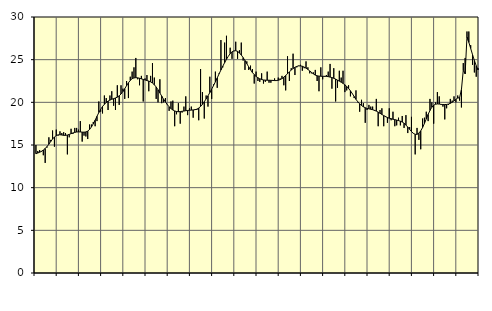
| Category | Piggar | Series 1 |
|---|---|---|
| nan | 15 | 13.97 |
| 1.0 | 14.3 | 14.06 |
| 1.0 | 14.4 | 14.15 |
| 1.0 | 14.2 | 14.26 |
| 1.0 | 13.8 | 14.41 |
| 1.0 | 12.9 | 14.59 |
| 1.0 | 14.7 | 14.82 |
| 1.0 | 15.9 | 15.1 |
| 1.0 | 15.6 | 15.41 |
| 1.0 | 16.7 | 15.7 |
| 1.0 | 14.8 | 15.94 |
| 1.0 | 16.8 | 16.11 |
| nan | 16.1 | 16.19 |
| 2.0 | 16.6 | 16.2 |
| 2.0 | 16.4 | 16.17 |
| 2.0 | 16.5 | 16.13 |
| 2.0 | 16.4 | 16.13 |
| 2.0 | 13.9 | 16.17 |
| 2.0 | 15.9 | 16.24 |
| 2.0 | 16.9 | 16.33 |
| 2.0 | 16.3 | 16.41 |
| 2.0 | 17 | 16.48 |
| 2.0 | 17 | 16.52 |
| 2.0 | 16.8 | 16.54 |
| nan | 17.8 | 16.53 |
| 3.0 | 15.4 | 16.51 |
| 3.0 | 16.1 | 16.5 |
| 3.0 | 16 | 16.53 |
| 3.0 | 15.7 | 16.63 |
| 3.0 | 17.4 | 16.82 |
| 3.0 | 17.4 | 17.11 |
| 3.0 | 17.7 | 17.48 |
| 3.0 | 17.2 | 17.91 |
| 3.0 | 17.8 | 18.36 |
| 3.0 | 20.1 | 18.8 |
| 3.0 | 18.9 | 19.19 |
| nan | 18.7 | 19.51 |
| 4.0 | 20.8 | 19.77 |
| 4.0 | 20.5 | 19.98 |
| 4.0 | 19.1 | 20.14 |
| 4.0 | 20.8 | 20.26 |
| 4.0 | 21.3 | 20.36 |
| 4.0 | 19.6 | 20.43 |
| 4.0 | 19.1 | 20.51 |
| 4.0 | 22 | 20.61 |
| 4.0 | 19.7 | 20.76 |
| 4.0 | 22 | 20.98 |
| 4.0 | 21.6 | 21.26 |
| nan | 20.4 | 21.6 |
| 5.0 | 22.5 | 21.95 |
| 5.0 | 20.5 | 22.29 |
| 5.0 | 23 | 22.57 |
| 5.0 | 23.6 | 22.77 |
| 5.0 | 24.1 | 22.86 |
| 5.0 | 25.2 | 22.89 |
| 5.0 | 22.7 | 22.87 |
| 5.0 | 22 | 22.82 |
| 5.0 | 23.1 | 22.75 |
| 5.0 | 20.1 | 22.69 |
| 5.0 | 22.8 | 22.62 |
| nan | 23.2 | 22.55 |
| 6.0 | 21.3 | 22.49 |
| 6.0 | 23.1 | 22.4 |
| 6.0 | 24.6 | 22.26 |
| 6.0 | 22.9 | 22.06 |
| 6.0 | 20.4 | 21.8 |
| 6.0 | 20 | 21.47 |
| 6.0 | 22.7 | 21.1 |
| 6.0 | 19.9 | 20.73 |
| 6.0 | 20 | 20.37 |
| 6.0 | 20.5 | 20.04 |
| 6.0 | 19.7 | 19.74 |
| nan | 19 | 19.48 |
| 7.0 | 20.1 | 19.26 |
| 7.0 | 20.2 | 19.1 |
| 7.0 | 17.2 | 18.99 |
| 7.0 | 18.6 | 18.92 |
| 7.0 | 19.9 | 18.9 |
| 7.0 | 17.5 | 18.92 |
| 7.0 | 18.8 | 18.95 |
| 7.0 | 19.5 | 18.98 |
| 7.0 | 20.7 | 19.02 |
| 7.0 | 18.5 | 19.05 |
| 7.0 | 19.3 | 19.07 |
| nan | 19.5 | 19.09 |
| 8.0 | 18.2 | 19.11 |
| 8.0 | 19.1 | 19.14 |
| 8.0 | 19.1 | 19.2 |
| 8.0 | 17.9 | 19.33 |
| 8.0 | 23.9 | 19.52 |
| 8.0 | 21.2 | 19.76 |
| 8.0 | 18.1 | 20.07 |
| 8.0 | 20.8 | 20.4 |
| 8.0 | 19.5 | 20.76 |
| 8.0 | 23 | 21.14 |
| 8.0 | 20.4 | 21.54 |
| nan | 22.1 | 21.96 |
| 9.0 | 23.6 | 22.4 |
| 9.0 | 21.7 | 22.86 |
| 9.0 | 23.4 | 23.33 |
| 9.0 | 27.3 | 23.79 |
| 9.0 | 24.1 | 24.23 |
| 9.0 | 27 | 24.65 |
| 9.0 | 27.8 | 25.04 |
| 9.0 | 25.4 | 25.4 |
| 9.0 | 26.4 | 25.7 |
| 9.0 | 25.1 | 25.92 |
| 9.0 | 26 | 26.03 |
| nan | 27.1 | 26.05 |
| 10.0 | 25.1 | 25.97 |
| 10.0 | 26.1 | 25.79 |
| 10.0 | 27 | 25.55 |
| 10.0 | 24.9 | 25.24 |
| 10.0 | 23.8 | 24.9 |
| 10.0 | 24.8 | 24.53 |
| 10.0 | 23.8 | 24.16 |
| 10.0 | 24.3 | 23.81 |
| 10.0 | 23.9 | 23.5 |
| 10.0 | 22.2 | 23.24 |
| 10.0 | 23.6 | 23.04 |
| nan | 22.5 | 22.88 |
| 11.0 | 22.4 | 22.76 |
| 11.0 | 23.4 | 22.68 |
| 11.0 | 22.2 | 22.62 |
| 11.0 | 22.4 | 22.6 |
| 11.0 | 23.6 | 22.59 |
| 11.0 | 22.3 | 22.59 |
| 11.0 | 22.3 | 22.58 |
| 11.0 | 22.5 | 22.57 |
| 11.0 | 22.8 | 22.55 |
| 11.0 | 22.5 | 22.55 |
| 11.0 | 22.9 | 22.59 |
| nan | 22.8 | 22.66 |
| 12.0 | 23.1 | 22.78 |
| 12.0 | 22 | 22.95 |
| 12.0 | 21.4 | 23.14 |
| 12.0 | 25.4 | 23.35 |
| 12.0 | 22.5 | 23.57 |
| 12.0 | 24 | 23.78 |
| 12.0 | 25.7 | 23.96 |
| 12.0 | 23.2 | 24.11 |
| 12.0 | 24.1 | 24.21 |
| 12.0 | 24.3 | 24.27 |
| 12.0 | 24.4 | 24.27 |
| nan | 23.7 | 24.23 |
| 13.0 | 24 | 24.13 |
| 13.0 | 24.8 | 24.01 |
| 13.0 | 24.1 | 23.86 |
| 13.0 | 23.4 | 23.68 |
| 13.0 | 23.4 | 23.5 |
| 13.0 | 23.5 | 23.33 |
| 13.0 | 23.8 | 23.19 |
| 13.0 | 22.5 | 23.11 |
| 13.0 | 21.3 | 23.07 |
| 13.0 | 24.1 | 23.06 |
| 13.0 | 22.7 | 23.05 |
| nan | 23 | 23.05 |
| 14.0 | 23.2 | 23.04 |
| 14.0 | 23.6 | 23.01 |
| 14.0 | 24.5 | 22.96 |
| 14.0 | 21.6 | 22.9 |
| 14.0 | 24 | 22.82 |
| 14.0 | 20.1 | 22.72 |
| 14.0 | 21.7 | 22.6 |
| 14.0 | 23.7 | 22.48 |
| 14.0 | 22.9 | 22.36 |
| 14.0 | 23.7 | 22.22 |
| 14.0 | 21.2 | 22.05 |
| nan | 21.4 | 21.86 |
| 15.0 | 22 | 21.63 |
| 15.0 | 20.7 | 21.35 |
| 15.0 | 21 | 21.03 |
| 15.0 | 20.5 | 20.69 |
| 15.0 | 21.4 | 20.35 |
| 15.0 | 20 | 20.06 |
| 15.0 | 18.9 | 19.82 |
| 15.0 | 20.3 | 19.63 |
| 15.0 | 19.9 | 19.48 |
| 15.0 | 17.6 | 19.37 |
| 15.0 | 19.1 | 19.29 |
| nan | 19.7 | 19.24 |
| 16.0 | 19.5 | 19.19 |
| 16.0 | 19.5 | 19.14 |
| 16.0 | 19 | 19.06 |
| 16.0 | 20.4 | 18.97 |
| 16.0 | 17.2 | 18.85 |
| 16.0 | 19.1 | 18.72 |
| 16.0 | 19.3 | 18.58 |
| 16.0 | 17.2 | 18.45 |
| 16.0 | 18.4 | 18.32 |
| 16.0 | 17.6 | 18.22 |
| 16.0 | 19.3 | 18.14 |
| nan | 17.9 | 18.08 |
| 17.0 | 18.9 | 18.02 |
| 17.0 | 17.2 | 17.97 |
| 17.0 | 17.3 | 17.92 |
| 17.0 | 18.2 | 17.86 |
| 17.0 | 17.3 | 17.79 |
| 17.0 | 18.4 | 17.69 |
| 17.0 | 17 | 17.55 |
| 17.0 | 18.5 | 17.34 |
| 17.0 | 16.4 | 17.1 |
| 17.0 | 17.1 | 16.84 |
| 17.0 | 18.3 | 16.58 |
| nan | 16.4 | 16.37 |
| 18.0 | 13.9 | 16.25 |
| 18.0 | 17 | 16.25 |
| 18.0 | 15.6 | 16.39 |
| 18.0 | 14.5 | 16.66 |
| 18.0 | 18.1 | 17.04 |
| 18.0 | 18.2 | 17.52 |
| 18.0 | 18.9 | 18.06 |
| 18.0 | 17.8 | 18.59 |
| 18.0 | 20.4 | 19.05 |
| 18.0 | 20 | 19.42 |
| 18.0 | 17.5 | 19.66 |
| nan | 20 | 19.78 |
| 19.0 | 21.2 | 19.81 |
| 19.0 | 20.7 | 19.8 |
| 19.0 | 19.8 | 19.76 |
| 19.0 | 19.5 | 19.74 |
| 19.0 | 18 | 19.74 |
| 19.0 | 19.3 | 19.75 |
| 19.0 | 19.7 | 19.8 |
| 19.0 | 20.4 | 19.88 |
| 19.0 | 20.2 | 20.01 |
| 19.0 | 20.7 | 20.17 |
| 19.0 | 20 | 20.35 |
| nan | 20.8 | 20.5 |
| 20.0 | 20.2 | 20.55 |
| 20.0 | 19.4 | 21.49 |
| 20.0 | 24.6 | 23.76 |
| 20.0 | 25.2 | 23.34 |
| 20.0 | 28.3 | 27.7 |
| 20.0 | 28.3 | 27.04 |
| 20.0 | 26.7 | 26.32 |
| 20.0 | 24.4 | 25.59 |
| 20.0 | 23.5 | 24.9 |
| 20.0 | 23 | 24.29 |
| 20.0 | 24 | 23.79 |